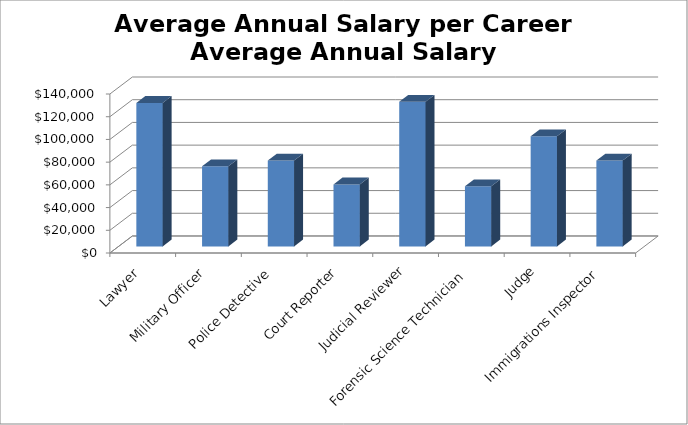
| Category | Average Annual Salary per Career Average Annual Salary |
|---|---|
| Lawyer | 126370 |
| Military Officer | 70518 |
| Police Detective | 75590 |
| Court Reporter | 54590 |
| Judicial Reviewer | 127350 |
| Forensic Science Technician | 53020 |
| Judge | 96900 |
| Immigrations Inspector | 75590 |